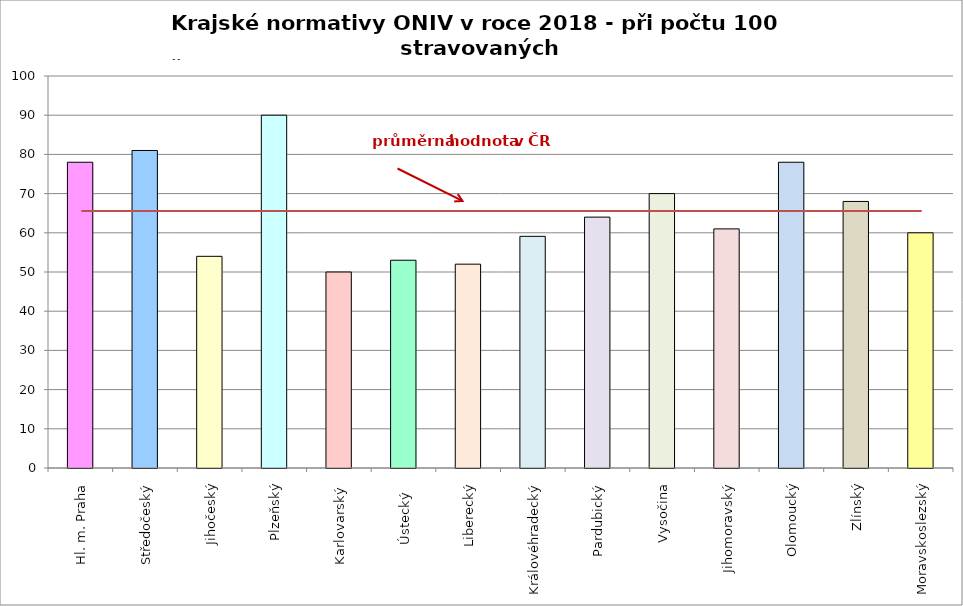
| Category | Series 0 |
|---|---|
| Hl. m. Praha | 78 |
| Středočeský | 81 |
| Jihočeský | 54 |
| Plzeňský | 90 |
| Karlovarský  | 50 |
| Ústecký   | 53 |
| Liberecký | 52 |
| Královéhradecký | 59.1 |
| Pardubický | 64 |
| Vysočina | 70 |
| Jihomoravský | 61 |
| Olomoucký | 78 |
| Zlínský | 68 |
| Moravskoslezský | 60 |